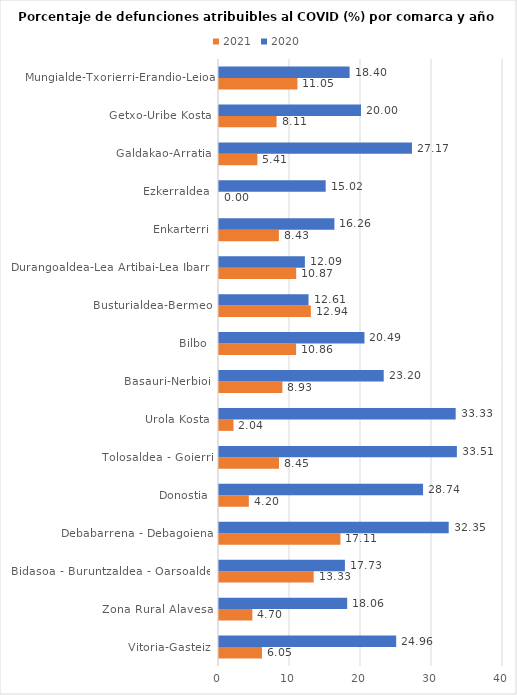
| Category | 2021 | 2020 |
|---|---|---|
| Vitoria-Gasteiz | 6.051 | 24.957 |
| Zona Rural Alavesa | 4.698 | 18.056 |
| Bidasoa - Buruntzaldea - Oarsoaldea | 13.333 | 17.734 |
| Debabarrena - Debagoiena | 17.105 | 32.353 |
| Donostia | 4.202 | 28.743 |
| Tolosaldea - Goierri | 8.451 | 33.505 |
| Urola Kosta | 2.041 | 33.333 |
| Basauri-Nerbioi | 8.929 | 23.2 |
| Bilbo | 10.857 | 20.486 |
| Busturialdea-Bermeo | 12.941 | 12.613 |
| Durangoaldea-Lea Artibai-Lea Ibarra | 10.87 | 12.093 |
| Enkarterri | 8.434 | 16.256 |
| Ezkerraldea | 0 | 15.023 |
| Galdakao-Arratia | 5.405 | 27.174 |
| Getxo-Uribe Kosta | 8.108 | 20 |
| Mungialde-Txorierri-Erandio-Leioa | 11.047 | 18.396 |